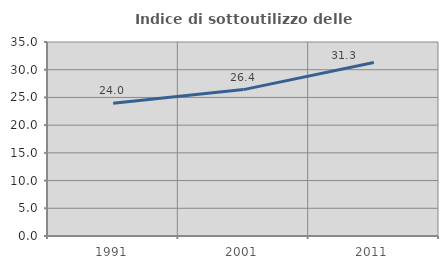
| Category | Indice di sottoutilizzo delle abitazioni  |
|---|---|
| 1991.0 | 23.96 |
| 2001.0 | 26.412 |
| 2011.0 | 31.301 |